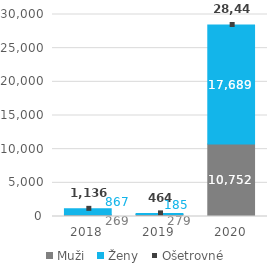
| Category | Muži | Ženy |
|---|---|---|
| 0 | 268.917 | 867.083 |
| 1 | 278.833 | 184.917 |
| 2 | 10752.273 | 17689.455 |